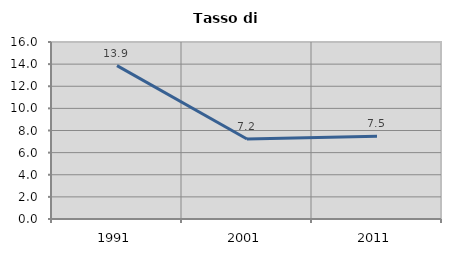
| Category | Tasso di disoccupazione   |
|---|---|
| 1991.0 | 13.861 |
| 2001.0 | 7.232 |
| 2011.0 | 7.47 |